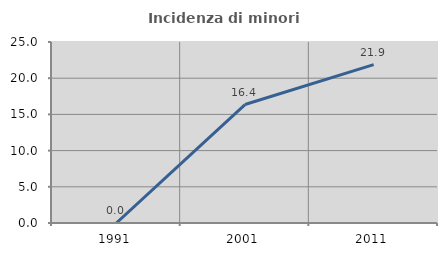
| Category | Incidenza di minori stranieri |
|---|---|
| 1991.0 | 0 |
| 2001.0 | 16.364 |
| 2011.0 | 21.875 |